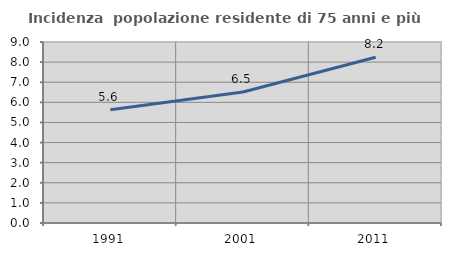
| Category | Incidenza  popolazione residente di 75 anni e più |
|---|---|
| 1991.0 | 5.634 |
| 2001.0 | 6.516 |
| 2011.0 | 8.244 |